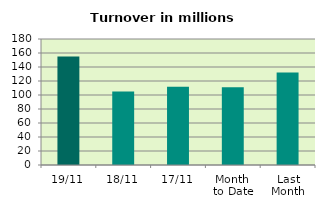
| Category | Series 0 |
|---|---|
| 19/11 | 155.006 |
| 18/11 | 105.153 |
| 17/11 | 111.673 |
| Month 
to Date | 111.044 |
| Last
Month | 132.268 |